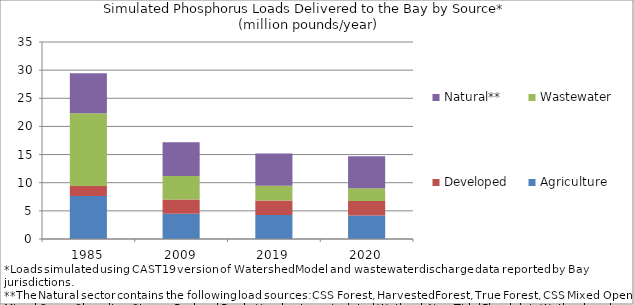
| Category | Agriculture | Developed | Wastewater | Natural** |
|---|---|---|---|---|
| 1985.0 | 7.638 | 1.791 | 12.931 | 7.07 |
| 2009.0 | 4.467 | 2.542 | 4.189 | 5.973 |
| 2019.0 | 4.244 | 2.606 | 2.608 | 5.727 |
| 2020.0 | 4.16 | 2.608 | 2.259 | 5.686 |